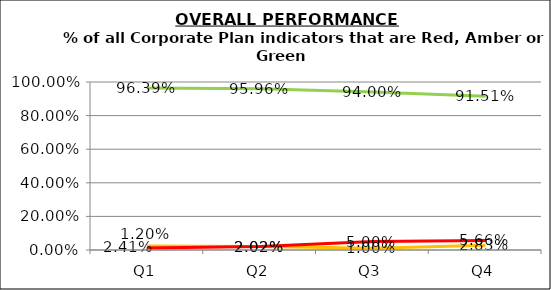
| Category | Green | Amber | Red |
|---|---|---|---|
| Q1 | 0.964 | 0.024 | 0.012 |
| Q2 | 0.96 | 0.02 | 0.02 |
| Q3 | 0.94 | 0.01 | 0.05 |
| Q4 | 0.915 | 0.028 | 0.057 |